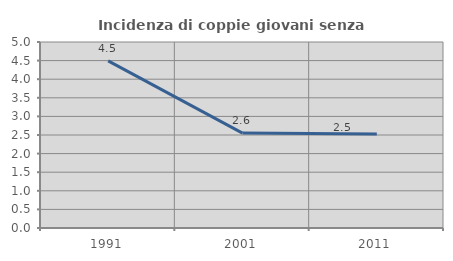
| Category | Incidenza di coppie giovani senza figli |
|---|---|
| 1991.0 | 4.493 |
| 2001.0 | 2.552 |
| 2011.0 | 2.526 |